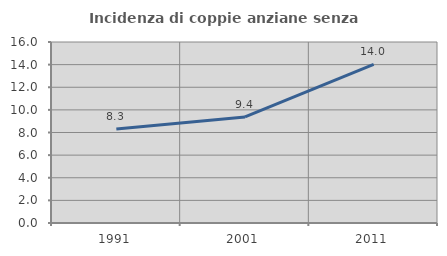
| Category | Incidenza di coppie anziane senza figli  |
|---|---|
| 1991.0 | 8.305 |
| 2001.0 | 9.378 |
| 2011.0 | 14.026 |